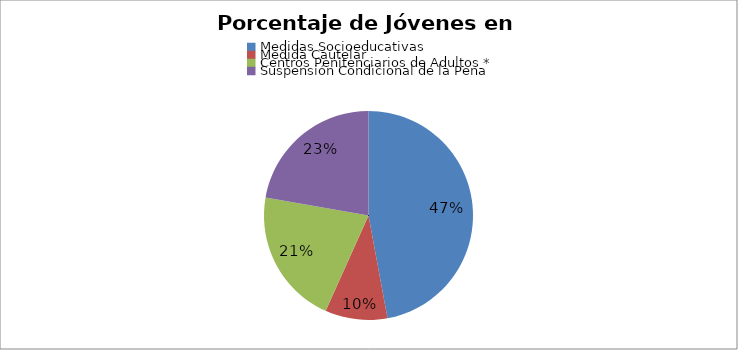
| Category | Series 0 |
|---|---|
| Medidas Socioeducativas | 396 |
| Medida Cautelar | 81 |
| Centros Penitenciarios de Adultos * | 177 |
| Suspensión Condicional de la Pena | 187 |